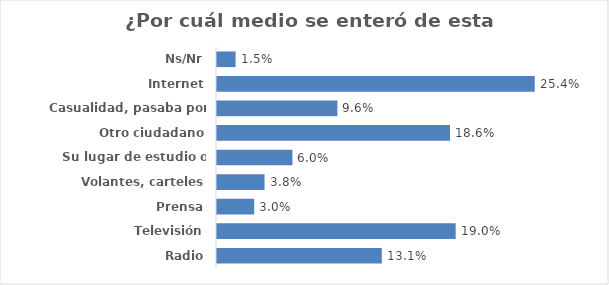
| Category | Series 0 |
|---|---|
| Radio | 0.131 |
| Televisión | 0.19 |
| Prensa | 0.03 |
| Volantes, carteles | 0.038 |
| Su lugar de estudio o trabajo | 0.06 |
| Otro ciudadano | 0.186 |
| Casualidad, pasaba por aquí | 0.096 |
| Internet | 0.254 |
| Ns/Nr | 0.015 |